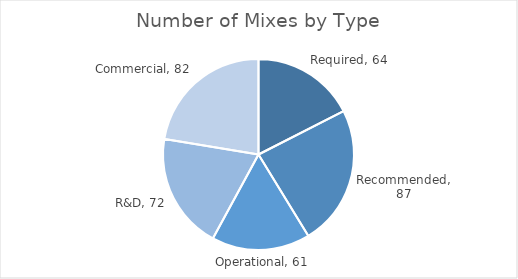
| Category | Number |
|---|---|
| Required | 64 |
| Recommended | 87 |
| Operational | 61 |
| R&D | 72 |
| Commercial | 82 |